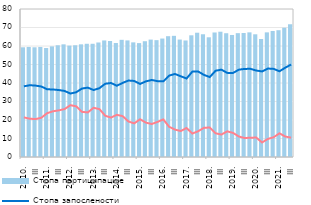
| Category | Стопа партиципације  |
|---|---|
| 2010. | 59.3 |
| II | 59.5 |
| III | 59.3 |
| IV | 59.5 |
| 2011. | 58.9 |
| II | 59.8 |
| III | 60.4 |
| IV | 60.9 |
| 2012. | 60.2 |
| II | 60.4 |
| III | 60.9 |
| IV | 61.2 |
| 2013. | 61.2 |
| II | 61.9 |
| III | 63 |
| IV | 62.7 |
| 2014. | 61.618 |
| II | 63.339 |
| III | 63.021 |
| IV | 61.968 |
| 2015. | 61.562 |
| II | 62.578 |
| III | 63.461 |
| IV | 63.162 |
| 2016. | 64.03 |
| II | 65.299 |
| III | 65.502 |
| IV | 63.48 |
| 2017. | 62.988 |
| II | 65.783 |
| III | 67.173 |
| IV | 66.346 |
| 2018. | 64.703 |
| II | 67.308 |
| III | 67.721 |
| IV | 66.898 |
| 2019. | 65.968 |
| II | 66.941 |
| III | 67.038 |
| IV | 67.376 |
| 2020. | 66.327 |
| II | 63.79 |
| III | 67.371 |
| IV | 68.129 |
| 2021. | 68.532 |
| II | 69.8 |
| III | 71.7 |